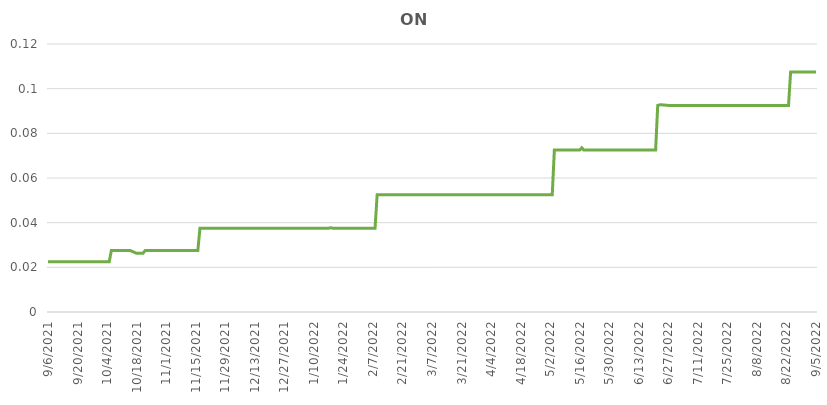
| Category | ON |
|---|---|
| 9/6/21 | 0.022 |
| 9/7/21 | 0.022 |
| 9/8/21 | 0.022 |
| 9/9/21 | 0.022 |
| 9/10/21 | 0.022 |
| 9/13/21 | 0.022 |
| 9/14/21 | 0.022 |
| 9/15/21 | 0.022 |
| 9/16/21 | 0.022 |
| 9/17/21 | 0.022 |
| 9/20/21 | 0.022 |
| 9/21/21 | 0.022 |
| 9/22/21 | 0.022 |
| 9/23/21 | 0.022 |
| 9/24/21 | 0.022 |
| 9/27/21 | 0.022 |
| 9/28/21 | 0.022 |
| 9/29/21 | 0.022 |
| 9/30/21 | 0.022 |
| 10/1/21 | 0.022 |
| 10/4/21 | 0.022 |
| 10/5/21 | 0.022 |
| 10/6/21 | 0.028 |
| 10/7/21 | 0.028 |
| 10/8/21 | 0.028 |
| 10/11/21 | 0.028 |
| 10/12/21 | 0.028 |
| 10/13/21 | 0.028 |
| 10/14/21 | 0.028 |
| 10/15/21 | 0.028 |
| 10/18/21 | 0.026 |
| 10/19/21 | 0.026 |
| 10/20/21 | 0.026 |
| 10/21/21 | 0.026 |
| 10/22/21 | 0.028 |
| 10/25/21 | 0.028 |
| 10/26/21 | 0.028 |
| 10/27/21 | 0.028 |
| 10/28/21 | 0.028 |
| 10/29/21 | 0.028 |
| 11/1/21 | 0.028 |
| 11/2/21 | 0.028 |
| 11/3/21 | 0.028 |
| 11/4/21 | 0.028 |
| 11/5/21 | 0.028 |
| 11/8/21 | 0.028 |
| 11/9/21 | 0.028 |
| 11/10/21 | 0.028 |
| 11/11/21 | 0.028 |
| 11/12/21 | 0.028 |
| 11/15/21 | 0.028 |
| 11/16/21 | 0.028 |
| 11/17/21 | 0.038 |
| 11/18/21 | 0.038 |
| 11/19/21 | 0.038 |
| 11/22/21 | 0.038 |
| 11/23/21 | 0.038 |
| 11/24/21 | 0.038 |
| 11/25/21 | 0.038 |
| 11/26/21 | 0.038 |
| 11/29/21 | 0.038 |
| 11/30/21 | 0.038 |
| 12/1/21 | 0.038 |
| 12/2/21 | 0.038 |
| 12/3/21 | 0.038 |
| 12/6/21 | 0.038 |
| 12/7/21 | 0.038 |
| 12/8/21 | 0.038 |
| 12/9/21 | 0.038 |
| 12/10/21 | 0.038 |
| 12/13/21 | 0.038 |
| 12/14/21 | 0.038 |
| 12/15/21 | 0.038 |
| 12/16/21 | 0.038 |
| 12/17/21 | 0.038 |
| 12/20/21 | 0.038 |
| 12/21/21 | 0.038 |
| 12/22/21 | 0.038 |
| 12/23/21 | 0.038 |
| 12/27/21 | 0.038 |
| 12/28/21 | 0.038 |
| 12/29/21 | 0.038 |
| 12/30/21 | 0.038 |
| 12/31/21 | 0.038 |
| 1/3/22 | 0.038 |
| 1/4/22 | 0.038 |
| 1/5/22 | 0.038 |
| 1/6/22 | 0.038 |
| 1/7/22 | 0.038 |
| 1/10/22 | 0.038 |
| 1/11/22 | 0.038 |
| 1/12/22 | 0.038 |
| 1/13/22 | 0.038 |
| 1/14/22 | 0.038 |
| 1/17/22 | 0.038 |
| 1/18/22 | 0.038 |
| 1/19/22 | 0.038 |
| 1/20/22 | 0.038 |
| 1/21/22 | 0.038 |
| 1/24/22 | 0.038 |
| 1/25/22 | 0.038 |
| 1/26/22 | 0.038 |
| 1/27/22 | 0.038 |
| 1/28/22 | 0.038 |
| 1/31/22 | 0.038 |
| 2/1/22 | 0.038 |
| 2/2/22 | 0.038 |
| 2/3/22 | 0.038 |
| 2/4/22 | 0.038 |
| 2/7/22 | 0.038 |
| 2/8/22 | 0.038 |
| 2/9/22 | 0.052 |
| 2/10/22 | 0.052 |
| 2/11/22 | 0.052 |
| 2/14/22 | 0.052 |
| 2/15/22 | 0.052 |
| 2/16/22 | 0.052 |
| 2/17/22 | 0.052 |
| 2/18/22 | 0.052 |
| 2/21/22 | 0.052 |
| 2/22/22 | 0.052 |
| 2/23/22 | 0.052 |
| 2/24/22 | 0.052 |
| 2/25/22 | 0.052 |
| 2/28/22 | 0.052 |
| 3/1/22 | 0.052 |
| 3/2/22 | 0.052 |
| 3/3/22 | 0.052 |
| 3/4/22 | 0.052 |
| 3/7/22 | 0.052 |
| 3/8/22 | 0.052 |
| 3/9/22 | 0.052 |
| 3/10/22 | 0.052 |
| 3/11/22 | 0.052 |
| 3/14/22 | 0.052 |
| 3/15/22 | 0.052 |
| 3/16/22 | 0.052 |
| 3/17/22 | 0.052 |
| 3/18/22 | 0.052 |
| 3/21/22 | 0.052 |
| 3/22/22 | 0.052 |
| 3/23/22 | 0.052 |
| 3/24/22 | 0.052 |
| 3/25/22 | 0.052 |
| 3/28/22 | 0.052 |
| 3/29/22 | 0.052 |
| 3/30/22 | 0.052 |
| 3/31/22 | 0.052 |
| 4/1/22 | 0.052 |
| 4/4/22 | 0.052 |
| 4/5/22 | 0.052 |
| 4/6/22 | 0.052 |
| 4/7/22 | 0.052 |
| 4/8/22 | 0.052 |
| 4/11/22 | 0.052 |
| 4/12/22 | 0.052 |
| 4/13/22 | 0.052 |
| 4/19/22 | 0.052 |
| 4/20/22 | 0.052 |
| 4/22/22 | 0.052 |
| 4/25/22 | 0.052 |
| 4/26/22 | 0.052 |
| 4/27/22 | 0.052 |
| 4/28/22 | 0.052 |
| 4/29/22 | 0.052 |
| 5/2/22 | 0.052 |
| 5/3/22 | 0.052 |
| 5/4/22 | 0.072 |
| 5/5/22 | 0.072 |
| 5/6/22 | 0.072 |
| 5/9/22 | 0.072 |
| 5/10/22 | 0.072 |
| 5/11/22 | 0.072 |
| 5/12/22 | 0.072 |
| 5/13/22 | 0.072 |
| 5/16/22 | 0.072 |
| 5/17/22 | 0.074 |
| 5/18/22 | 0.072 |
| 5/19/22 | 0.072 |
| 5/20/22 | 0.072 |
| 5/23/22 | 0.072 |
| 5/24/22 | 0.072 |
| 5/25/22 | 0.072 |
| 5/27/22 | 0.072 |
| 5/30/22 | 0.072 |
| 5/31/22 | 0.072 |
| 6/1/22 | 0.072 |
| 6/2/22 | 0.072 |
| 6/3/22 | 0.072 |
| 6/7/22 | 0.072 |
| 6/8/22 | 0.072 |
| 6/9/22 | 0.072 |
| 6/10/22 | 0.072 |
| 6/13/22 | 0.072 |
| 6/14/22 | 0.072 |
| 6/15/22 | 0.072 |
| 6/16/22 | 0.072 |
| 6/20/22 | 0.072 |
| 6/21/22 | 0.072 |
| 6/22/22 | 0.092 |
| 6/23/22 | 0.093 |
| 6/24/22 | 0.093 |
| 6/27/22 | 0.092 |
| 6/28/22 | 0.092 |
| 6/29/22 | 0.092 |
| 6/30/22 | 0.092 |
| 7/1/22 | 0.092 |
| 7/4/22 | 0.092 |
| 7/5/22 | 0.092 |
| 7/6/22 | 0.092 |
| 7/7/22 | 0.092 |
| 7/8/22 | 0.092 |
| 7/11/22 | 0.092 |
| 7/12/22 | 0.092 |
| 7/13/22 | 0.092 |
| 7/14/22 | 0.092 |
| 7/15/22 | 0.092 |
| 7/18/22 | 0.092 |
| 7/19/22 | 0.092 |
| 7/20/22 | 0.092 |
| 7/21/22 | 0.092 |
| 7/22/22 | 0.092 |
| 7/25/22 | 0.092 |
| 7/26/22 | 0.092 |
| 7/27/22 | 0.092 |
| 7/28/22 | 0.092 |
| 7/29/22 | 0.092 |
| 8/2/22 | 0.092 |
| 8/3/22 | 0.092 |
| 8/4/22 | 0.092 |
| 8/5/22 | 0.092 |
| 8/8/22 | 0.092 |
| 8/9/22 | 0.092 |
| 8/10/22 | 0.092 |
| 8/11/22 | 0.092 |
| 8/12/22 | 0.092 |
| 8/15/22 | 0.092 |
| 8/16/22 | 0.092 |
| 8/17/22 | 0.092 |
| 8/18/22 | 0.092 |
| 8/19/22 | 0.092 |
| 8/22/22 | 0.092 |
| 8/23/22 | 0.092 |
| 8/24/22 | 0.108 |
| 8/25/22 | 0.108 |
| 8/26/22 | 0.108 |
| 8/29/22 | 0.108 |
| 8/30/22 | 0.108 |
| 8/31/22 | 0.108 |
| 9/1/22 | 0.108 |
| 9/2/22 | 0.108 |
| 9/5/22 | 0.108 |